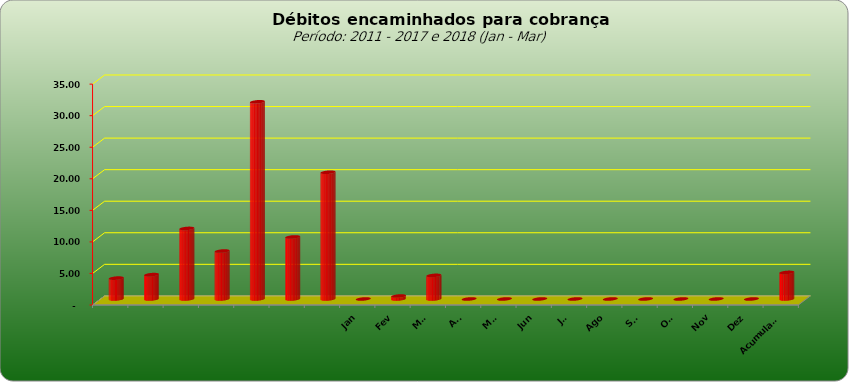
| Category |  3.309.443,02  |
|---|---|
|  | 3309443.02 |
|  | 3859728.44 |
|  | 11181928.25 |
|  | 7600526.01 |
|  | 31248623.5 |
|  | 9830198.34 |
|  | 20083556.95 |
| Jan | 0 |
| Fev | 468831.1 |
| Mar | 3741527.45 |
| Abr | 0 |
| Mai | 0 |
| Jun | 0 |
| Jul | 0 |
| Ago | 0 |
| Set | 0 |
| Out | 0 |
| Nov | 0 |
| Dez | 0 |
| Acumulado | 4210358.55 |